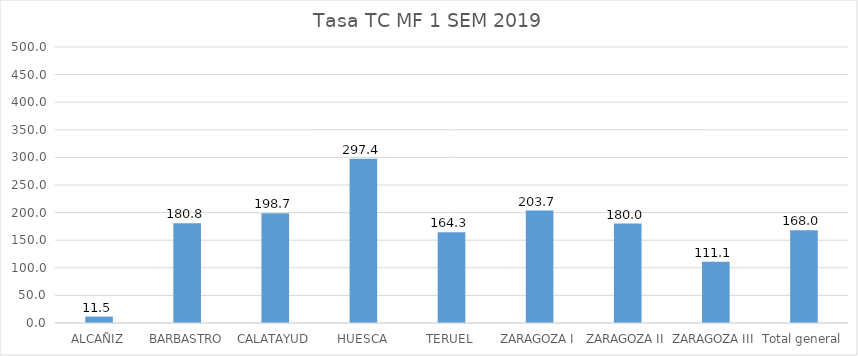
| Category | 1SEM2019 |
|---|---|
| ALCAÑIZ | 11.546 |
| BARBASTRO | 180.773 |
| CALATAYUD | 198.702 |
| HUESCA | 297.4 |
| TERUEL | 164.314 |
| ZARAGOZA I | 203.683 |
| ZARAGOZA II | 180.027 |
| ZARAGOZA III | 111.073 |
| Total general | 168.046 |